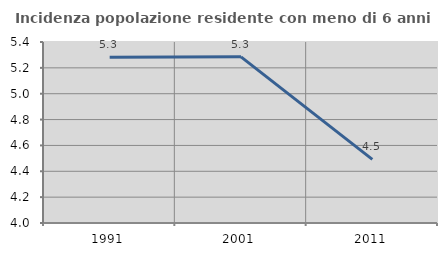
| Category | Incidenza popolazione residente con meno di 6 anni |
|---|---|
| 1991.0 | 5.282 |
| 2001.0 | 5.285 |
| 2011.0 | 4.492 |